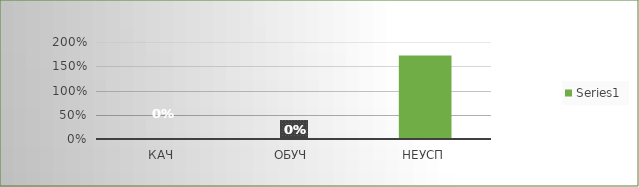
| Category | Series 0 |
|---|---|
| кач | 0 |
| обуч | 0 |
| неусп | 1.722 |